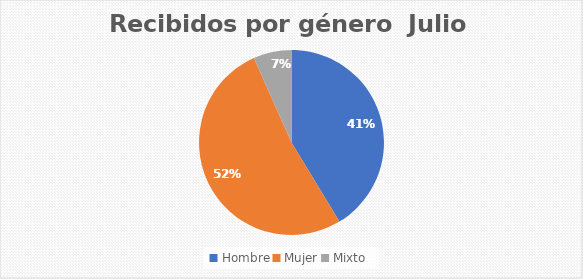
| Category | Recibidos por género  Julio |
|---|---|
| Hombre | 31 |
| Mujer | 39 |
| Mixto | 5 |